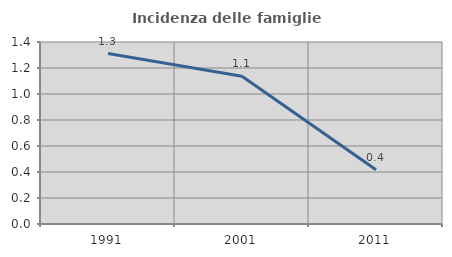
| Category | Incidenza delle famiglie numerose |
|---|---|
| 1991.0 | 1.311 |
| 2001.0 | 1.136 |
| 2011.0 | 0.417 |